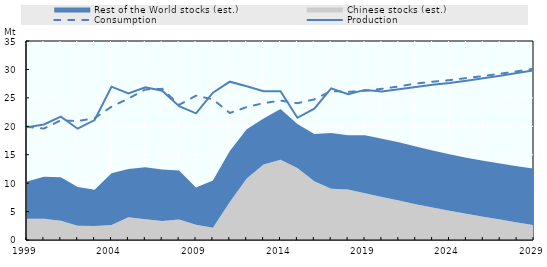
| Category | Production | Consumption |
|---|---|---|
| 1999.0 | 19.826 | 19.895 |
| 2000.0 | 20.309 | 19.6 |
| 2001.0 | 21.685 | 21.052 |
| 2002.0 | 19.574 | 20.911 |
| 2003.0 | 21.095 | 21.431 |
| 2004.0 | 26.965 | 23.445 |
| 2005.0 | 25.797 | 24.868 |
| 2006.0 | 26.85 | 26.477 |
| 2007.0 | 26.266 | 26.585 |
| 2008.0 | 23.535 | 23.768 |
| 2009.0 | 22.273 | 25.385 |
| 2010.0 | 25.919 | 24.738 |
| 2011.0 | 27.846 | 22.34 |
| 2012.0 | 27.049 | 23.375 |
| 2013.0 | 26.163 | 24.068 |
| 2014.0 | 26.18 | 24.521 |
| 2015.0 | 21.499 | 24.062 |
| 2016.0 | 23.101 | 24.729 |
| 2017.0 | 26.665 | 26.211 |
| 2018.0 | 25.659 | 26.052 |
| 2019.0 | 26.401 | 26.24 |
| 2020.0 | 26.122 | 26.595 |
| 2021.0 | 26.508 | 27.009 |
| 2022.0 | 26.9 | 27.514 |
| 2023.0 | 27.29 | 27.842 |
| 2024.0 | 27.604 | 28.117 |
| 2025.0 | 28.015 | 28.478 |
| 2026.0 | 28.433 | 28.841 |
| 2027.0 | 28.896 | 29.243 |
| 2028.0 | 29.366 | 29.675 |
| 2029.0 | 29.829 | 30.13 |